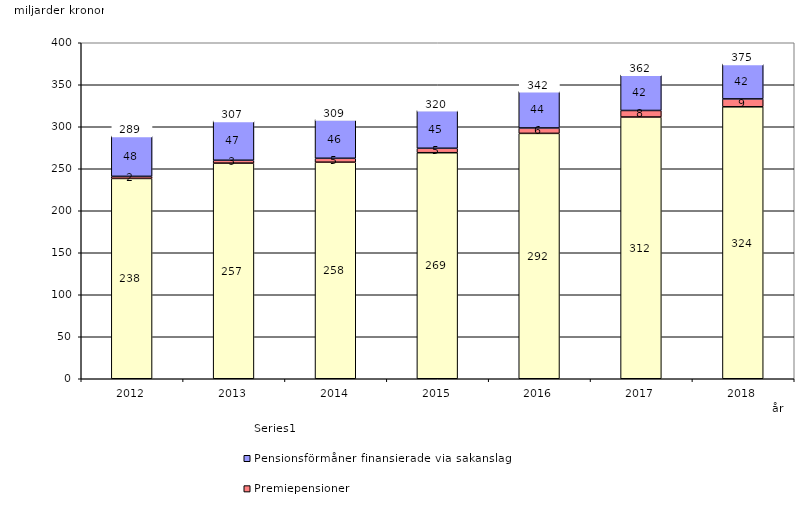
| Category | Inkomstpension och tilläggspension m.m. | Premiepensioner | Pensionsförmåner finansierade via sakanslag | Series 0 |
|---|---|---|---|---|
| 2012.0 | 238.478 | 2.465 | 48.024 | 20 |
| 2013.0 | 256.703 | 3.406 | 46.818 | 20 |
| 2014.0 | 257.805 | 4.676 | 46.25 | 20 |
| 2015.0 | 269.089 | 5.305 | 45.167 | 20 |
| 2016.0 | 292.121 | 6.451 | 43.668 | 20 |
| 2017.0 | 311.598 | 7.78 | 42.448 | 20 |
| 2018.0 | 323.763 | 9.391 | 41.667 | 20 |